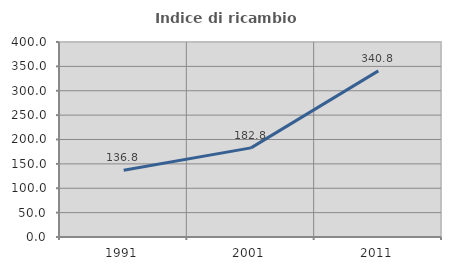
| Category | Indice di ricambio occupazionale  |
|---|---|
| 1991.0 | 136.816 |
| 2001.0 | 182.84 |
| 2011.0 | 340.8 |